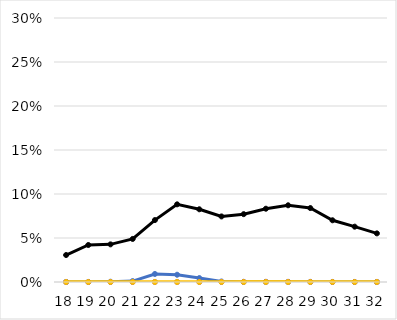
| Category | Total | miRNAs | TE | Virus |
|---|---|---|---|---|
| 18.0 | 0.031 | 0 | 0 | 0 |
| 19.0 | 0.042 | 0 | 0 | 0 |
| 20.0 | 0.043 | 0 | 0 | 0 |
| 21.0 | 0.049 | 0.001 | 0 | 0 |
| 22.0 | 0.07 | 0.009 | 0 | 0 |
| 23.0 | 0.088 | 0.008 | 0 | 0 |
| 24.0 | 0.083 | 0.004 | 0 | 0 |
| 25.0 | 0.075 | 0.001 | 0 | 0 |
| 26.0 | 0.077 | 0 | 0 | 0 |
| 27.0 | 0.083 | 0 | 0 | 0 |
| 28.0 | 0.087 | 0 | 0 | 0 |
| 29.0 | 0.084 | 0 | 0 | 0 |
| 30.0 | 0.07 | 0 | 0 | 0 |
| 31.0 | 0.063 | 0 | 0 | 0 |
| 32.0 | 0.055 | 0 | 0 | 0 |